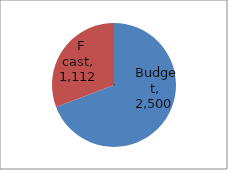
| Category | Series 0 |
|---|---|
| Budget | 2500 |
| F cast | 1111.904 |